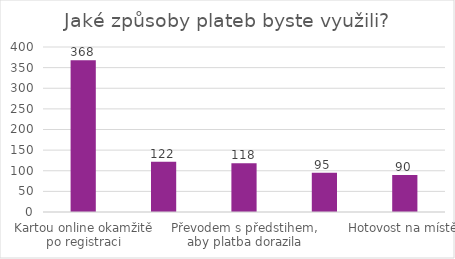
| Category | Series 0 |
|---|---|
| Kartou online okamžitě po registraci | 368 |
| Kartou online později, ale před závodem | 122 |
| Převodem s předstihem, aby platba dorazila | 118 |
| Kartou na místě | 95 |
| Hotovost na místě | 90 |